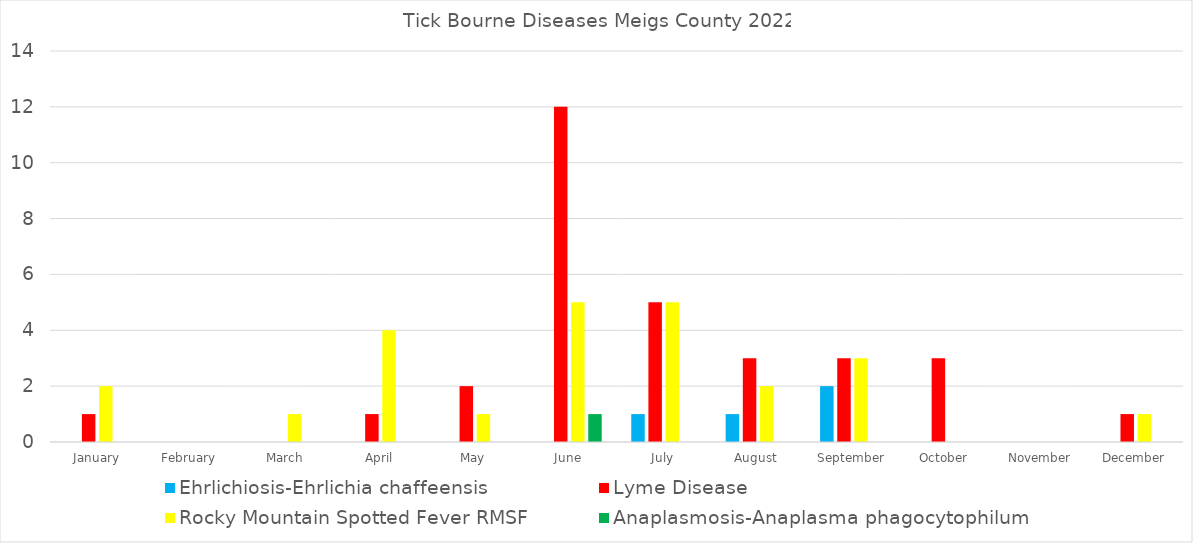
| Category | Ehrlichiosis-Ehrlichia chaffeensis | Lyme Disease | Rocky Mountain Spotted Fever RMSF | Anaplasmosis-Anaplasma phagocytophilum |
|---|---|---|---|---|
| January | 0 | 1 | 2 | 0 |
| February  | 0 | 0 | 0 | 0 |
| March | 0 | 0 | 1 | 0 |
| April | 0 | 1 | 4 | 0 |
| May | 0 | 2 | 1 | 0 |
| June | 0 | 12 | 5 | 1 |
| July | 1 | 5 | 5 | 0 |
| August  | 1 | 3 | 2 | 0 |
| September | 2 | 3 | 3 | 0 |
| October  | 0 | 3 | 0 | 0 |
| November | 0 | 0 | 0 | 0 |
| December | 0 | 1 | 1 | 0 |